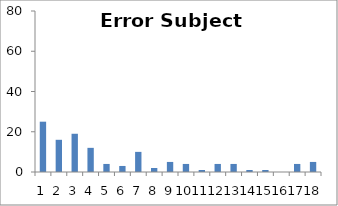
| Category | Sub3 |
|---|---|
| 0 | 25 |
| 1 | 16 |
| 2 | 19 |
| 3 | 12 |
| 4 | 4 |
| 5 | 3 |
| 6 | 10 |
| 7 | 2 |
| 8 | 5 |
| 9 | 4 |
| 10 | 1 |
| 11 | 4 |
| 12 | 4 |
| 13 | 1 |
| 14 | 1 |
| 15 | 0 |
| 16 | 4 |
| 17 | 5 |